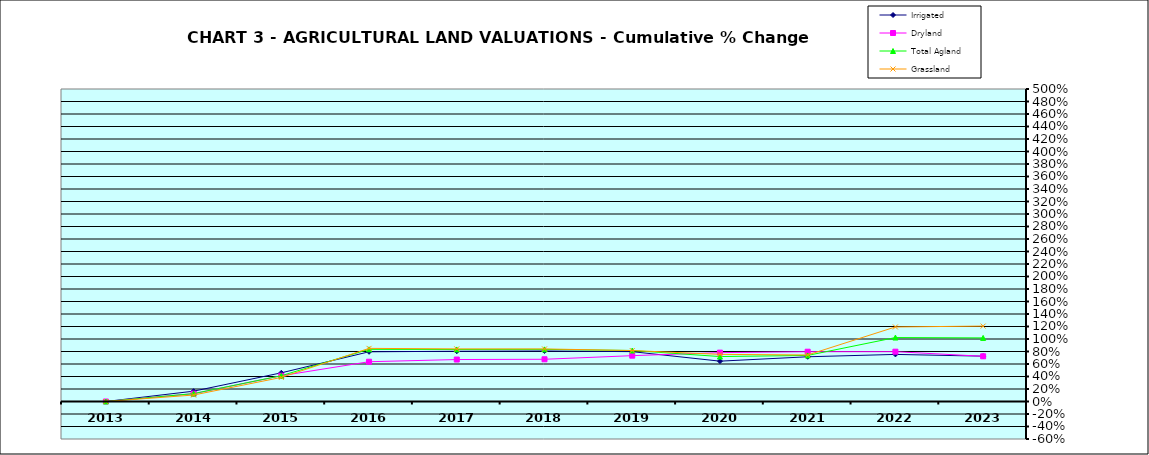
| Category | Irrigated | Dryland | Total Agland | Grassland |
|---|---|---|---|---|
| 2013.0 | 0 | 0 | 0 | 0 |
| 2014.0 | 0.165 | 0.125 | 0.126 | 0.104 |
| 2015.0 | 0.459 | 0.412 | 0.413 | 0.385 |
| 2016.0 | 0.795 | 0.636 | 0.835 | 0.85 |
| 2017.0 | 0.804 | 0.671 | 0.833 | 0.842 |
| 2018.0 | 0.808 | 0.676 | 0.834 | 0.841 |
| 2019.0 | 0.798 | 0.733 | 0.816 | 0.815 |
| 2020.0 | 0.645 | 0.782 | 0.719 | 0.754 |
| 2021.0 | 0.716 | 0.797 | 0.737 | 0.745 |
| 2022.0 | 0.753 | 0.797 | 1.023 | 1.193 |
| 2023.0 | 0.725 | 0.723 | 1.018 | 1.207 |